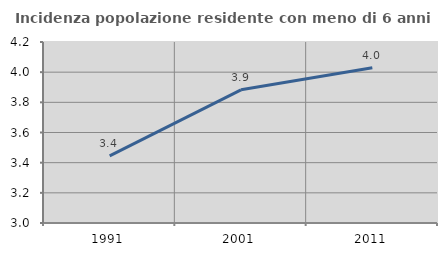
| Category | Incidenza popolazione residente con meno di 6 anni |
|---|---|
| 1991.0 | 3.445 |
| 2001.0 | 3.883 |
| 2011.0 | 4.029 |